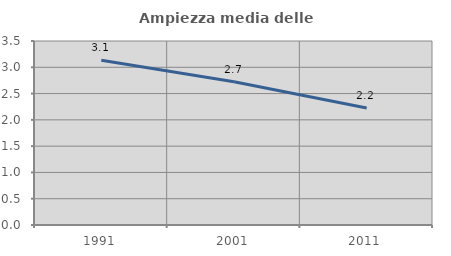
| Category | Ampiezza media delle famiglie |
|---|---|
| 1991.0 | 3.133 |
| 2001.0 | 2.723 |
| 2011.0 | 2.226 |